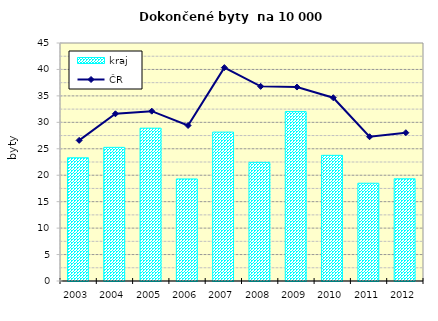
| Category | kraj |
|---|---|
| 2003.0 | 23.299 |
| 2004.0 | 25.267 |
| 2005.0 | 28.893 |
| 2006.0 | 19.292 |
| 2007.0 | 28.153 |
| 2008.0 | 22.433 |
| 2009.0 | 32.031 |
| 2010.0 | 23.761 |
| 2011.0 | 18.487 |
| 2012.0 | 19.327 |